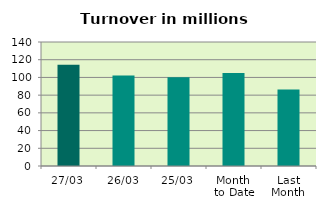
| Category | Series 0 |
|---|---|
| 27/03 | 114.358 |
| 26/03 | 102.228 |
| 25/03 | 100.232 |
| Month 
to Date | 105.132 |
| Last
Month | 86.247 |